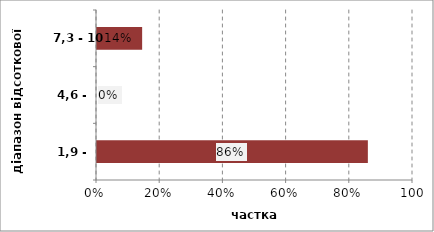
| Category | Series 0 |
|---|---|
| 1,9 - 4,6 | 0.857 |
| 4,6 - 7,3 | 0 |
| 7,3 - 10 | 0.143 |